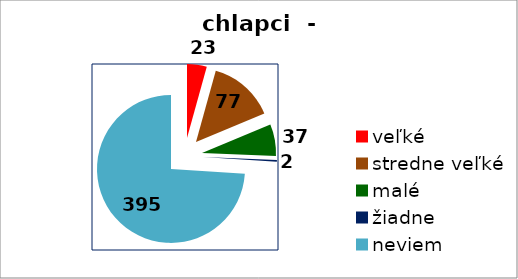
| Category | chlapci |
|---|---|
| veľké | 23 |
| stredne veľké | 77 |
| malé | 37 |
| žiadne | 2 |
| neviem | 395 |